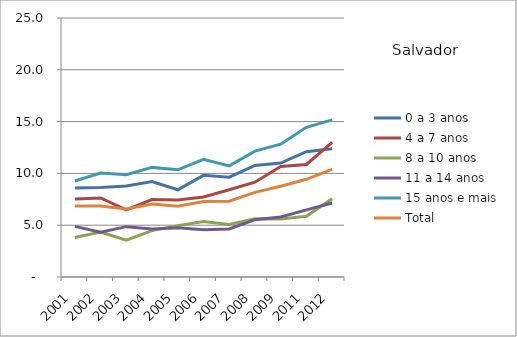
| Category | 0 a 3 anos | 4 a 7 anos | 8 a 10 anos | 11 a 14 anos | 15 anos e mais | Total |
|---|---|---|---|---|---|---|
| 2001.0 | 8.58 | 7.53 | 3.82 | 4.89 | 9.27 | 6.85 |
| 2002.0 | 8.64 | 7.63 | 4.33 | 4.33 | 10.04 | 6.86 |
| 2003.0 | 8.79 | 6.47 | 3.55 | 4.86 | 9.88 | 6.57 |
| 2004.0 | 9.22 | 7.47 | 4.48 | 4.64 | 10.58 | 7.04 |
| 2005.0 | 8.42 | 7.43 | 4.96 | 4.76 | 10.35 | 6.84 |
| 2006.0 | 9.81 | 7.73 | 5.35 | 4.55 | 11.35 | 7.29 |
| 2007.0 | 9.64 | 8.42 | 5.06 | 4.63 | 10.73 | 7.32 |
| 2008.0 | 10.77 | 9.15 | 5.62 | 5.53 | 12.15 | 8.17 |
| 2009.0 | 11 | 10.66 | 5.61 | 5.79 | 12.82 | 8.76 |
| 2011.0 | 12.09 | 10.86 | 5.86 | 6.48 | 14.45 | 9.43 |
| 2012.0 | 12.37 | 13 | 7.56 | 7.14 | 15.17 | 10.38 |